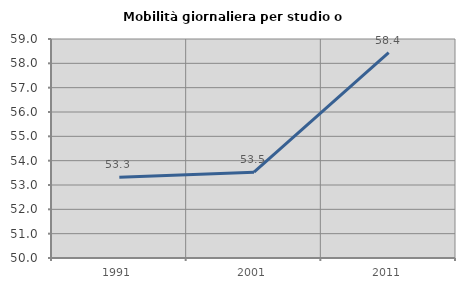
| Category | Mobilità giornaliera per studio o lavoro |
|---|---|
| 1991.0 | 53.313 |
| 2001.0 | 53.525 |
| 2011.0 | 58.441 |